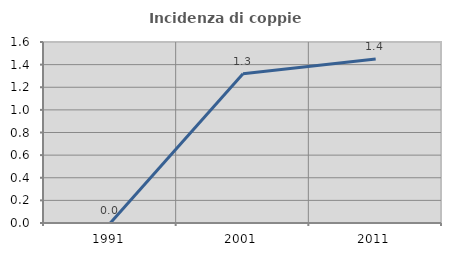
| Category | Incidenza di coppie miste |
|---|---|
| 1991.0 | 0 |
| 2001.0 | 1.319 |
| 2011.0 | 1.449 |